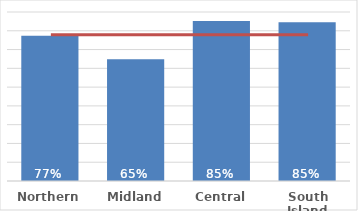
| Category | Total |
|---|---|
| Northern | 0.773 |
| Midland | 0.649 |
| Central | 0.853 |
| South Island | 0.846 |